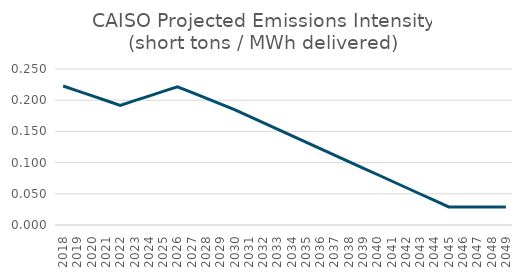
| Category | short tons/MWh |
|---|---|
| 2018.0 | 0.223 |
| 2019.0 | 0.215 |
| 2020.0 | 0.207 |
| 2021.0 | 0.2 |
| 2022.0 | 0.192 |
| 2023.0 | 0.199 |
| 2024.0 | 0.207 |
| 2025.0 | 0.214 |
| 2026.0 | 0.221 |
| 2027.0 | 0.212 |
| 2028.0 | 0.203 |
| 2029.0 | 0.194 |
| 2030.0 | 0.185 |
| 2031.0 | 0.175 |
| 2032.0 | 0.164 |
| 2033.0 | 0.154 |
| 2034.0 | 0.143 |
| 2035.0 | 0.133 |
| 2036.0 | 0.123 |
| 2037.0 | 0.112 |
| 2038.0 | 0.102 |
| 2039.0 | 0.091 |
| 2040.0 | 0.081 |
| 2041.0 | 0.071 |
| 2042.0 | 0.06 |
| 2043.0 | 0.05 |
| 2044.0 | 0.039 |
| 2045.0 | 0.029 |
| 2046.0 | 0.029 |
| 2047.0 | 0.029 |
| 2048.0 | 0.029 |
| 2049.0 | 0.029 |